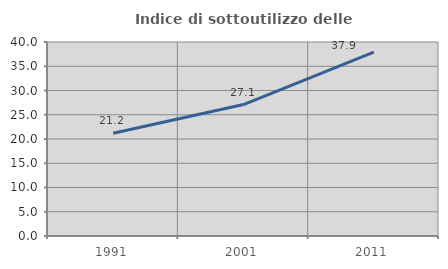
| Category | Indice di sottoutilizzo delle abitazioni  |
|---|---|
| 1991.0 | 21.186 |
| 2001.0 | 27.098 |
| 2011.0 | 37.915 |